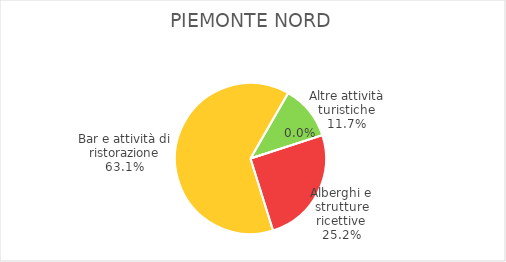
| Category | Piemonte Nord |
|---|---|
| Alberghi e strutture ricettive | 3506 |
| Bar e attività di ristorazione | 8791 |
| Altre attività turistiche | 1628 |